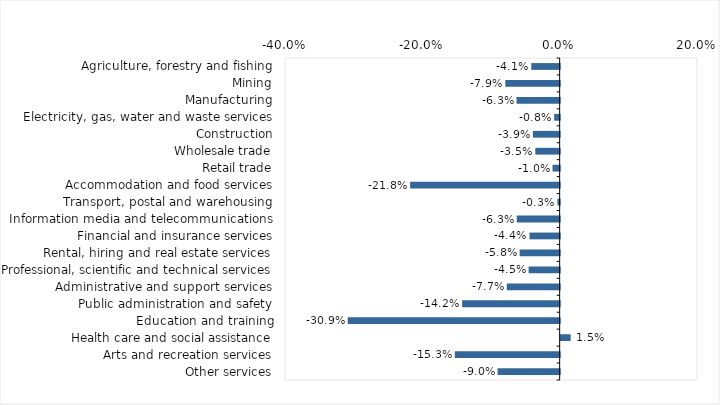
| Category | This week |
|---|---|
| Agriculture, forestry and fishing | -0.041 |
| Mining | -0.079 |
| Manufacturing | -0.063 |
| Electricity, gas, water and waste services | -0.008 |
| Construction | -0.039 |
| Wholesale trade | -0.035 |
| Retail trade | -0.01 |
| Accommodation and food services | -0.218 |
| Transport, postal and warehousing | -0.003 |
| Information media and telecommunications | -0.063 |
| Financial and insurance services | -0.044 |
| Rental, hiring and real estate services | -0.058 |
| Professional, scientific and technical services | -0.045 |
| Administrative and support services | -0.077 |
| Public administration and safety | -0.142 |
| Education and training | -0.309 |
| Health care and social assistance | 0.015 |
| Arts and recreation services | -0.153 |
| Other services | -0.09 |